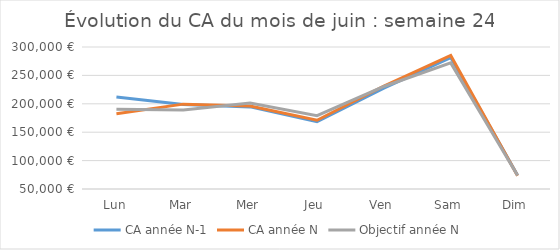
| Category | CA année N-1 | CA année N | Objectif année N |
|---|---|---|---|
| Lun | 212054 | 182562 | 190386 |
| Mar | 198737 | 199406 | 189068 |
| Mer | 194545 | 196162 | 201192 |
| Jeu | 168479 | 171002 | 179198 |
| Ven | 227693 | 231311 | 230513 |
| Sam | 281438 | 285075 | 272076 |
| Dim | 74306 | 73395 | 73913 |